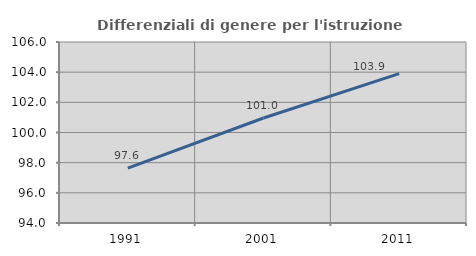
| Category | Differenziali di genere per l'istruzione superiore |
|---|---|
| 1991.0 | 97.633 |
| 2001.0 | 100.962 |
| 2011.0 | 103.899 |